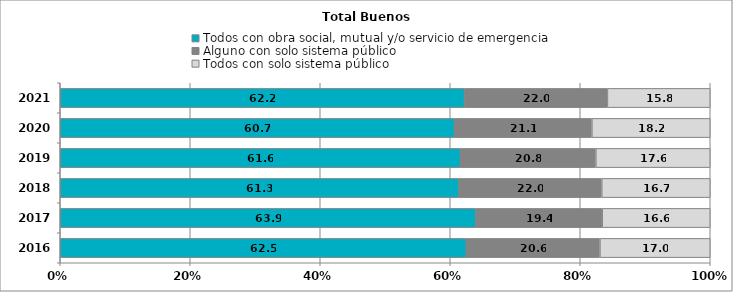
| Category | Todos con obra social, mutual y/o servicio de emergencia | Alguno con solo sistema público | Todos con solo sistema público |
|---|---|---|---|
| 2016.0 | 62.465 | 20.563 | 16.972 |
| 2017.0 | 63.941 | 19.439 | 16.621 |
| 2018.0 | 61.347 | 21.96 | 16.692 |
| 2019.0 | 61.553 | 20.844 | 17.603 |
| 2020.0 | 60.655 | 21.133 | 18.212 |
| 2021.0 | 62.192 | 21.987 | 15.821 |